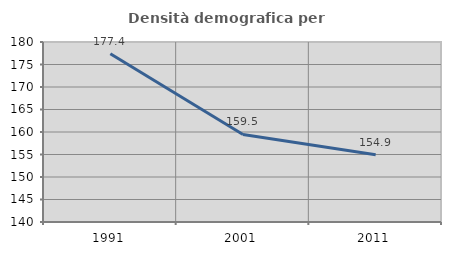
| Category | Densità demografica |
|---|---|
| 1991.0 | 177.392 |
| 2001.0 | 159.451 |
| 2011.0 | 154.924 |